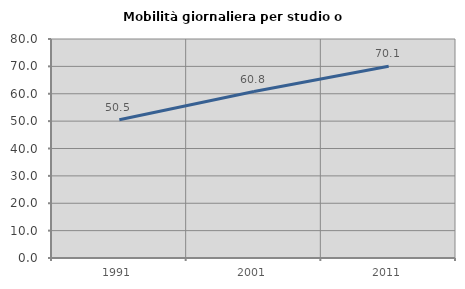
| Category | Mobilità giornaliera per studio o lavoro |
|---|---|
| 1991.0 | 50.51 |
| 2001.0 | 60.822 |
| 2011.0 | 70.076 |